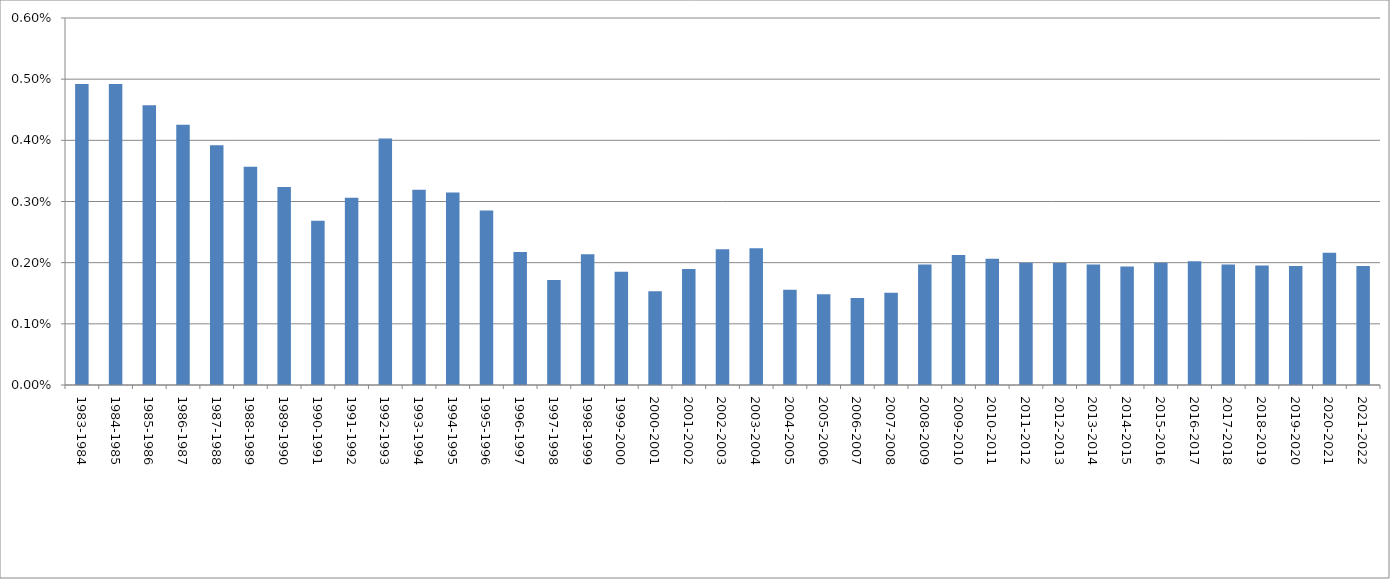
| Category | Series 0 |
|---|---|
| 1983-1984 | 0.005 |
| 1984-1985 | 0.005 |
| 1985-1986 | 0.005 |
| 1986-1987 | 0.004 |
| 1987-1988 | 0.004 |
| 1988-1989 | 0.004 |
| 1989-1990 | 0.003 |
| 1990-1991 | 0.003 |
| 1991-1992 | 0.003 |
| 1992-1993 | 0.004 |
| 1993-1994 | 0.003 |
| 1994-1995 | 0.003 |
| 1995-1996 | 0.003 |
| 1996-1997 | 0.002 |
| 1997-1998 | 0.002 |
| 1998-1999 | 0.002 |
| 1999-2000 | 0.002 |
| 2000-2001 | 0.002 |
| 2001-2002 | 0.002 |
| 2002-2003 | 0.002 |
| 2003-2004 | 0.002 |
| 2004-2005 | 0.002 |
| 2005-2006 | 0.001 |
| 2006-2007 | 0.001 |
| 2007-2008 | 0.002 |
| 2008-2009 | 0.002 |
| 2009-2010 | 0.002 |
| 2010-2011 | 0.002 |
| 2011-2012 | 0.002 |
| 2012-2013 | 0.002 |
| 2013-2014 | 0.002 |
| 2014-2015 | 0.002 |
| 2015-2016 | 0.002 |
| 2016-2017 | 0.002 |
| 2017-2018 | 0.002 |
| 2018-2019 | 0.002 |
| 2019-2020 | 0.002 |
| 2020-2021 | 0.002 |
| 2021-2022 | 0.002 |